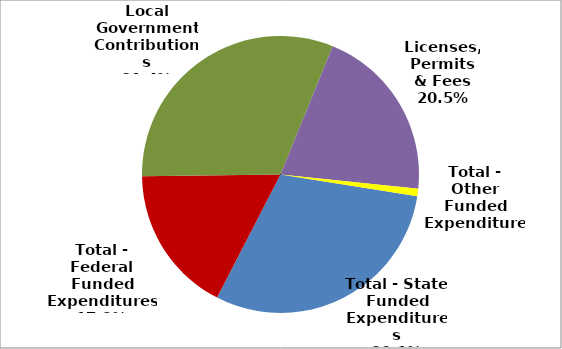
| Category | Series 0 |
|---|---|
| Total - State Funded Expenditures | 1137712 |
| Total - Federal Funded Expenditures | 651543 |
| Local Government Contributions | 1186435 |
| Licenses, Permits & Fees | 775017 |
| Total - Other Funded Expenditures | 32708 |